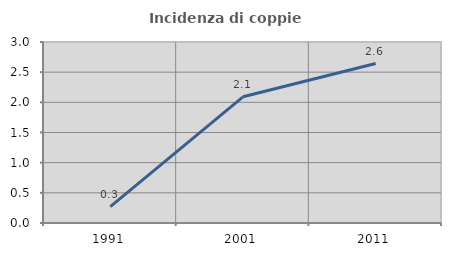
| Category | Incidenza di coppie miste |
|---|---|
| 1991.0 | 0.271 |
| 2001.0 | 2.092 |
| 2011.0 | 2.643 |